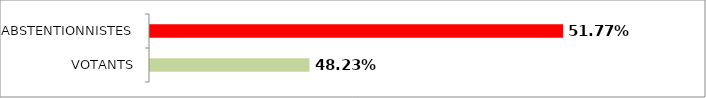
| Category | Series 0 |
|---|---|
| VOTANTS | 0.482 |
| ABSTENTIONNISTES | 0.518 |